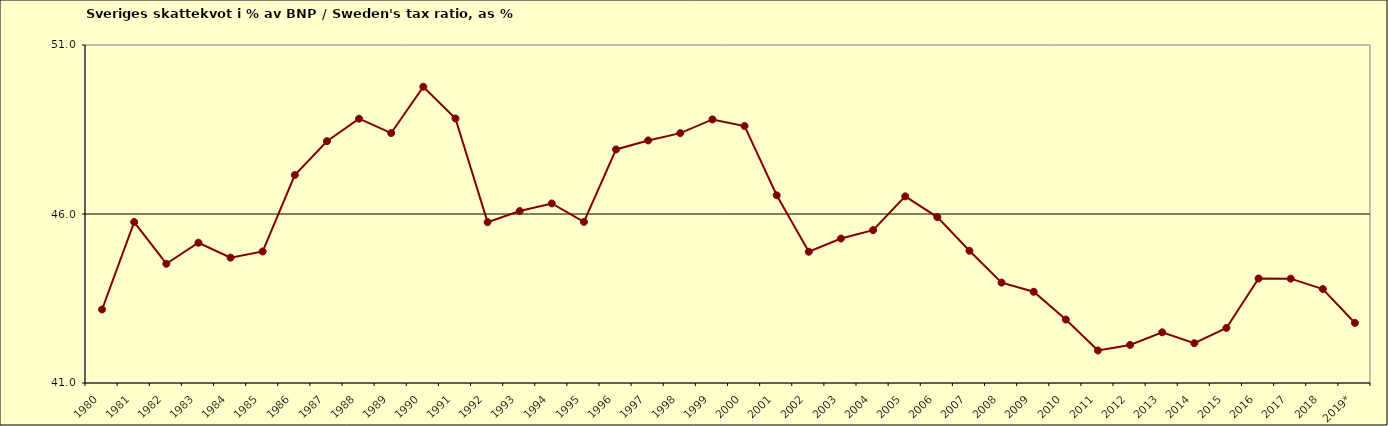
| Category | Series 0 |
|---|---|
| 1980 | 43.175 |
| 1981 | 45.762 |
| 1982 | 44.529 |
| 1983 | 45.149 |
| 1984 | 44.709 |
| 1985 | 44.891 |
| 1986 | 47.154 |
| 1987 | 48.154 |
| 1988 | 48.82 |
| 1989 | 48.394 |
| 1990 | 49.764 |
| 1991 | 48.827 |
| 1992 | 45.758 |
| 1993 | 46.087 |
| 1994 | 46.312 |
| 1995 | 45.767 |
| 1996 | 47.91 |
| 1997 | 48.176 |
| 1998 | 48.393 |
| 1999 | 48.798 |
| 2000 | 48.603 |
| 2001 | 46.554 |
| 2002 | 44.884 |
| 2003 | 45.274 |
| 2004 | 45.522 |
| 2005 | 46.522 |
| 2006 | 45.908 |
| 2007 | 44.912 |
| 2008 | 43.97 |
| 2009 | 43.699 |
| 2010 | 42.877 |
| 2011 | 41.962 |
| 2012 | 42.126 |
| 2013 | 42.5 |
| 2014 | 42.178 |
| 2015 | 42.629 |
| 2016 | 44.092 |
| 2017 | 44.087 |
| 2018 | 43.78 |
| 2019* | 42.777 |